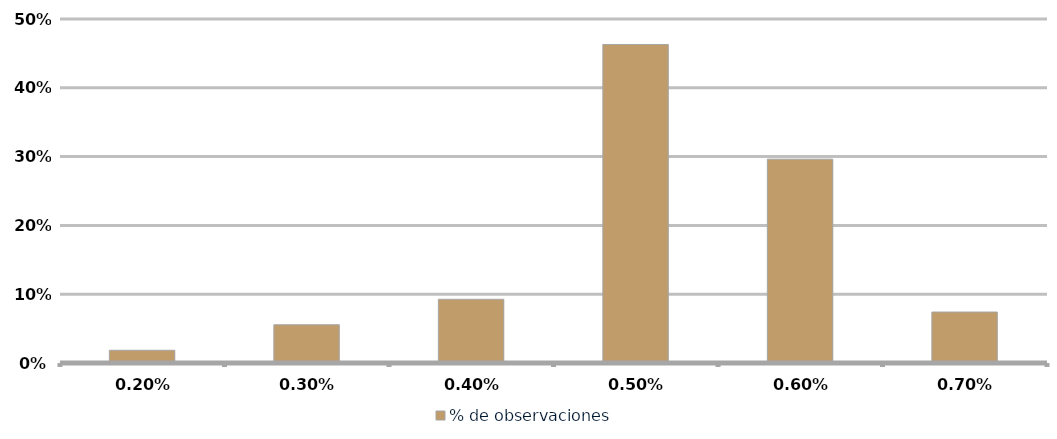
| Category | % de observaciones  |
|---|---|
| 0.002 | 0.019 |
| 0.003 | 0.056 |
| 0.004 | 0.093 |
| 0.005 | 0.463 |
| 0.006 | 0.296 |
| 0.007 | 0.074 |